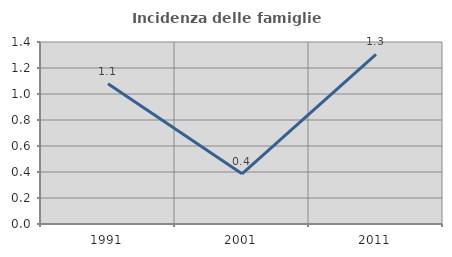
| Category | Incidenza delle famiglie numerose |
|---|---|
| 1991.0 | 1.079 |
| 2001.0 | 0.386 |
| 2011.0 | 1.304 |